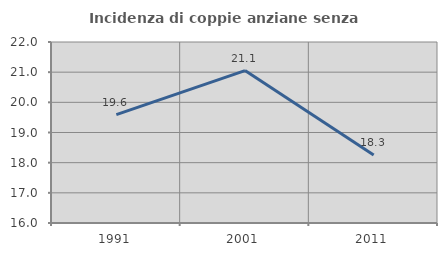
| Category | Incidenza di coppie anziane senza figli  |
|---|---|
| 1991.0 | 19.595 |
| 2001.0 | 21.053 |
| 2011.0 | 18.254 |